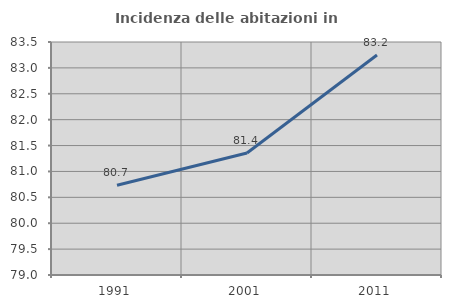
| Category | Incidenza delle abitazioni in proprietà  |
|---|---|
| 1991.0 | 80.732 |
| 2001.0 | 81.357 |
| 2011.0 | 83.249 |